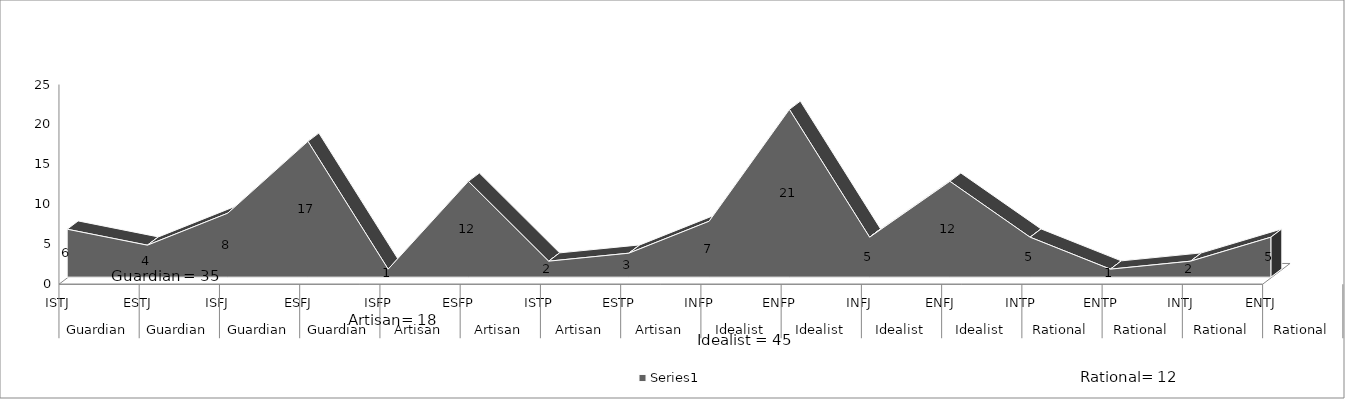
| Category | Series 0 |
|---|---|
| 0 | 6 |
| 1 | 4 |
| 2 | 8 |
| 3 | 17 |
| 4 | 1 |
| 5 | 12 |
| 6 | 2 |
| 7 | 3 |
| 8 | 7 |
| 9 | 21 |
| 10 | 5 |
| 11 | 12 |
| 12 | 5 |
| 13 | 1 |
| 14 | 2 |
| 15 | 5 |